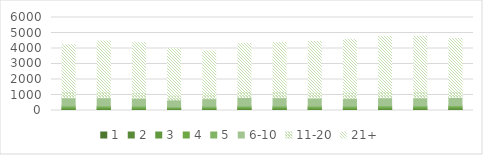
| Category | 1 | 2 | 3 | 4 | 5 | 6-10 | 11-20 | 21+ |
|---|---|---|---|---|---|---|---|---|
| wk1 | 50 | 47 | 54 | 72 | 77 | 520 | 401 | 3020 |
| wk2 | 57 | 51 | 53 | 70 | 69 | 523 | 395 | 3263 |
| wk3 | 54 | 41 | 45 | 74 | 77 | 497 | 372 | 3214 |
| wk4 | 51 | 41 | 34 | 58 | 57 | 445 | 304 | 3005 |
| wk5 | 62 | 38 | 32 | 61 | 84 | 483 | 380 | 2702 |
| wk6 | 70 | 38 | 44 | 82 | 57 | 551 | 397 | 3090 |
| wk7 | 61 | 41 | 54 | 69 | 68 | 534 | 407 | 3155 |
| wk8 | 57 | 39 | 55 | 70 | 74 | 503 | 382 | 3278 |
| wk9 | 57 | 33 | 51 | 71 | 77 | 492 | 391 | 3418 |
| wk10 | 61 | 43 | 54 | 71 | 82 | 508 | 420 | 3549 |
| wk11 | 60 | 44 | 59 | 73 | 72 | 505 | 424 | 3554 |
| wk12 | 65 | 39 | 72 | 67 | 78 | 523 | 417 | 3382 |